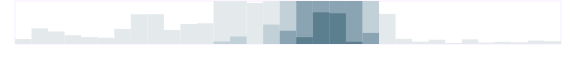
| Category | Техслужба | Series 1 | Series 2 | Series 3 |
|---|---|---|---|---|
| 0.333333333333333 | 86 | 0 | 0 | 0 |
| nan | 273 | 0 | 0 | 0 |
| nan | 218 | 0 | 0 | 0 |
| nan | 153 | 0 | 0 | 0 |
| 0.416666666666667 | 120 | 0 | 0 | 0 |
| nan | 109 | 0 | 0 | 0 |
| nan | 263 | 0 | 0 | 0 |
| nan | 518 | 0 | 0 | 0 |
| 0.5 | 519 | 0 | 0 | 0 |
| nan | 245 | 0 | 0 | 0 |
| nan | 349 | 0 | 0 | 0 |
| nan | 361 | 0 | 0 | 0 |
| 0.583333333333333 | 750 | 43 | 0 | 0 |
| nan | 750 | 131 | 0 | 0 |
| nan | 717 | 0 | 0 | 0 |
| nan | 750 | 339 | 0 | 0 |
| 0.666666666666667 | 750 | 750 | 231 | 0 |
| nan | 750 | 750 | 750 | 119 |
| nan | 750 | 750 | 750 | 553 |
| nan | 750 | 750 | 750 | 536 |
| 0.75 | 750 | 750 | 750 | 39 |
| nan | 750 | 750 | 193 | 0 |
| nan | 525 | 0 | 0 | 0 |
| nan | 90 | 0 | 0 | 0 |
| 0.833333333333333 | 41 | 0 | 0 | 0 |
| nan | 74 | 0 | 0 | 0 |
| nan | 15 | 0 | 0 | 0 |
| nan | 81 | 0 | 0 | 0 |
| 0.916666666666667 | 24 | 0 | 0 | 0 |
| nan | 37 | 0 | 0 | 0 |
| nan | 30 | 0 | 0 | 0 |
| nan | 59 | 0 | 0 | 0 |
| 0.9993055555555556 | 48 | 0 | 0 | 0 |